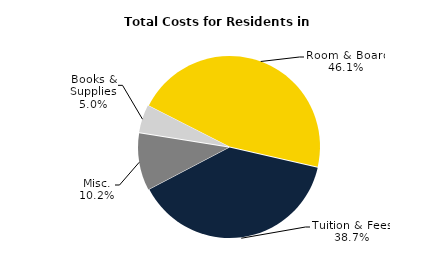
| Category | Series 0 |
|---|---|
| Room & Board | 0.461 |
| Tuition & Fees | 0.387 |
| Misc. | 0.102 |
| Books & Supplies | 0.05 |